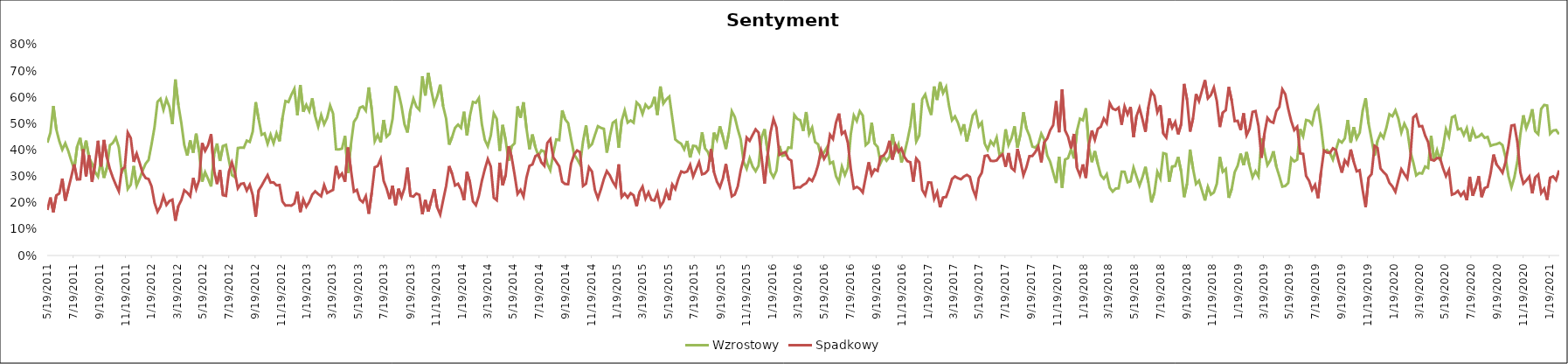
| Category | Wzrostowy | Spadkowy |
|---|---|---|
| 5/19/11 | 0.428 | 0.173 |
| 5/26/11 | 0.465 | 0.22 |
| 6/2/11 | 0.567 | 0.164 |
| 6/9/11 | 0.478 | 0.228 |
| 6/16/11 | 0.434 | 0.235 |
| 6/23/11 | 0.402 | 0.291 |
| 6/30/11 | 0.426 | 0.208 |
| 7/7/11 | 0.397 | 0.252 |
| 7/14/11 | 0.36 | 0.297 |
| 7/21/11 | 0.327 | 0.346 |
| 7/28/11 | 0.413 | 0.288 |
| 8/4/11 | 0.446 | 0.289 |
| 8/11/11 | 0.382 | 0.403 |
| 8/18/11 | 0.436 | 0.3 |
| 8/25/11 | 0.372 | 0.38 |
| 9/1/11 | 0.349 | 0.279 |
| 9/8/11 | 0.317 | 0.345 |
| 9/15/11 | 0.299 | 0.435 |
| 9/22/11 | 0.358 | 0.338 |
| 9/29/11 | 0.295 | 0.438 |
| 10/6/11 | 0.333 | 0.372 |
| 10/13/11 | 0.418 | 0.328 |
| 10/20/11 | 0.427 | 0.295 |
| 10/27/11 | 0.447 | 0.268 |
| 11/3/11 | 0.41 | 0.244 |
| 11/10/11 | 0.315 | 0.327 |
| 11/17/11 | 0.34 | 0.334 |
| 11/24/11 | 0.252 | 0.466 |
| 12/1/11 | 0.269 | 0.446 |
| 12/8/11 | 0.34 | 0.355 |
| 12/15/11 | 0.265 | 0.387 |
| 12/22/11 | 0.292 | 0.351 |
| 12/29/11 | 0.322 | 0.312 |
| 1/5/12 | 0.348 | 0.294 |
| 1/12/12 | 0.363 | 0.29 |
| 1/19/12 | 0.422 | 0.263 |
| 1/26/12 | 0.487 | 0.2 |
| 2/2/12 | 0.583 | 0.166 |
| 2/9/12 | 0.595 | 0.186 |
| 2/16/12 | 0.553 | 0.225 |
| 2/23/12 | 0.593 | 0.192 |
| 3/1/12 | 0.564 | 0.207 |
| 3/8/12 | 0.498 | 0.212 |
| 3/15/12 | 0.668 | 0.132 |
| 3/22/12 | 0.571 | 0.187 |
| 3/29/12 | 0.503 | 0.21 |
| 4/5/12 | 0.419 | 0.248 |
| 4/12/12 | 0.379 | 0.238 |
| 4/19/12 | 0.436 | 0.225 |
| 4/26/12 | 0.39 | 0.294 |
| 5/3/12 | 0.462 | 0.252 |
| 5/10/12 | 0.393 | 0.286 |
| 5/17/12 | 0.28 | 0.427 |
| 5/24/12 | 0.316 | 0.397 |
| 5/31/12 | 0.291 | 0.419 |
| 6/7/12 | 0.262 | 0.46 |
| 6/14/12 | 0.382 | 0.324 |
| 6/21/12 | 0.425 | 0.271 |
| 6/28/12 | 0.359 | 0.324 |
| 7/5/12 | 0.415 | 0.229 |
| 7/12/12 | 0.42 | 0.226 |
| 7/19/12 | 0.36 | 0.318 |
| 7/26/12 | 0.305 | 0.353 |
| 8/2/12 | 0.297 | 0.314 |
| 8/9/12 | 0.408 | 0.255 |
| 8/16/12 | 0.409 | 0.272 |
| 8/23/12 | 0.409 | 0.274 |
| 8/30/12 | 0.436 | 0.246 |
| 9/6/12 | 0.431 | 0.268 |
| 9/13/12 | 0.47 | 0.229 |
| 9/20/12 | 0.582 | 0.147 |
| 9/27/12 | 0.517 | 0.247 |
| 10/4/12 | 0.458 | 0.265 |
| 10/11/12 | 0.463 | 0.286 |
| 10/18/12 | 0.424 | 0.305 |
| 10/25/12 | 0.458 | 0.277 |
| 11/1/12 | 0.426 | 0.278 |
| 11/8/12 | 0.464 | 0.266 |
| 11/15/12 | 0.433 | 0.267 |
| 11/22/12 | 0.522 | 0.205 |
| 11/29/12 | 0.586 | 0.189 |
| 12/6/12 | 0.582 | 0.19 |
| 12/13/12 | 0.61 | 0.189 |
| 12/20/12 | 0.632 | 0.198 |
| 12/27/12 | 0.533 | 0.243 |
| 1/3/13 | 0.647 | 0.165 |
| 1/10/13 | 0.545 | 0.212 |
| 1/17/13 | 0.571 | 0.185 |
| 1/24/13 | 0.548 | 0.203 |
| 1/31/13 | 0.596 | 0.231 |
| 2/7/13 | 0.528 | 0.243 |
| 2/14/13 | 0.489 | 0.233 |
| 2/21/13 | 0.533 | 0.225 |
| 2/28/13 | 0.498 | 0.267 |
| 3/7/13 | 0.522 | 0.237 |
| 3/14/13 | 0.569 | 0.243 |
| 3/21/13 | 0.539 | 0.249 |
| 3/28/13 | 0.403 | 0.34 |
| 4/4/13 | 0.402 | 0.297 |
| 4/11/13 | 0.406 | 0.311 |
| 4/18/13 | 0.453 | 0.28 |
| 4/25/13 | 0.313 | 0.41 |
| 5/2/13 | 0.422 | 0.325 |
| 5/9/13 | 0.507 | 0.242 |
| 5/16/13 | 0.524 | 0.249 |
| 5/23/13 | 0.561 | 0.212 |
| 5/30/13 | 0.566 | 0.202 |
| 6/6/13 | 0.549 | 0.225 |
| 6/13/13 | 0.638 | 0.158 |
| 6/20/13 | 0.553 | 0.24 |
| 6/27/13 | 0.433 | 0.335 |
| 7/4/13 | 0.458 | 0.34 |
| 7/11/13 | 0.429 | 0.366 |
| 7/18/13 | 0.514 | 0.283 |
| 7/25/13 | 0.451 | 0.254 |
| 8/1/13 | 0.462 | 0.214 |
| 8/8/13 | 0.519 | 0.265 |
| 8/15/13 | 0.642 | 0.19 |
| 8/22/13 | 0.618 | 0.253 |
| 8/29/13 | 0.567 | 0.221 |
| 9/5/13 | 0.498 | 0.255 |
| 9/12/13 | 0.467 | 0.333 |
| 9/19/13 | 0.552 | 0.226 |
| 9/26/13 | 0.595 | 0.224 |
| 10/3/13 | 0.564 | 0.235 |
| 10/10/13 | 0.552 | 0.23 |
| 10/17/13 | 0.68 | 0.156 |
| 10/24/13 | 0.607 | 0.211 |
| 10/31/13 | 0.693 | 0.167 |
| 11/7/13 | 0.627 | 0.209 |
| 11/14/13 | 0.573 | 0.252 |
| 11/21/13 | 0.604 | 0.182 |
| 11/28/13 | 0.648 | 0.155 |
| 12/5/13 | 0.566 | 0.211 |
| 12/12/13 | 0.519 | 0.264 |
| 12/19/13 | 0.42 | 0.339 |
| 12/26/13 | 0.45 | 0.31 |
| 1/2/14 | 0.484 | 0.266 |
| 1/9/14 | 0.497 | 0.272 |
| 1/16/14 | 0.484 | 0.25 |
| 1/23/14 | 0.545 | 0.21 |
| 1/30/14 | 0.455 | 0.317 |
| 2/6/14 | 0.531 | 0.278 |
| 2/13/14 | 0.582 | 0.205 |
| 2/20/14 | 0.579 | 0.191 |
| 2/27/14 | 0.597 | 0.227 |
| 3/6/14 | 0.498 | 0.283 |
| 3/13/14 | 0.439 | 0.327 |
| 3/20/14 | 0.415 | 0.366 |
| 3/27/14 | 0.455 | 0.337 |
| 4/3/14 | 0.539 | 0.219 |
| 4/10/14 | 0.519 | 0.21 |
| 4/17/14 | 0.397 | 0.352 |
| 4/24/14 | 0.495 | 0.266 |
| 5/1/14 | 0.437 | 0.306 |
| 5/8/14 | 0.359 | 0.415 |
| 5/15/14 | 0.414 | 0.374 |
| 5/22/14 | 0.425 | 0.307 |
| 5/29/14 | 0.566 | 0.234 |
| 6/5/14 | 0.522 | 0.249 |
| 6/12/14 | 0.581 | 0.224 |
| 6/19/14 | 0.482 | 0.295 |
| 6/26/14 | 0.403 | 0.34 |
| 7/3/14 | 0.459 | 0.345 |
| 7/10/14 | 0.41 | 0.377 |
| 7/17/14 | 0.379 | 0.383 |
| 7/24/14 | 0.399 | 0.353 |
| 7/31/14 | 0.394 | 0.34 |
| 8/7/14 | 0.348 | 0.427 |
| 8/14/14 | 0.324 | 0.441 |
| 8/21/14 | 0.386 | 0.373 |
| 8/28/14 | 0.44 | 0.356 |
| 9/4/14 | 0.438 | 0.338 |
| 9/11/14 | 0.551 | 0.28 |
| 9/18/14 | 0.516 | 0.271 |
| 9/25/14 | 0.502 | 0.271 |
| 10/2/14 | 0.441 | 0.349 |
| 10/9/14 | 0.383 | 0.383 |
| 10/16/14 | 0.366 | 0.398 |
| 10/23/14 | 0.345 | 0.392 |
| 10/30/14 | 0.433 | 0.264 |
| 11/6/14 | 0.494 | 0.272 |
| 11/13/14 | 0.411 | 0.335 |
| 11/20/14 | 0.422 | 0.319 |
| 11/27/14 | 0.457 | 0.248 |
| 12/4/14 | 0.49 | 0.217 |
| 12/11/14 | 0.484 | 0.251 |
| 12/18/14 | 0.481 | 0.29 |
| 12/25/14 | 0.39 | 0.32 |
| 1/1/15 | 0.451 | 0.304 |
| 1/8/15 | 0.503 | 0.28 |
| 1/15/15 | 0.512 | 0.262 |
| 1/22/15 | 0.409 | 0.346 |
| 1/29/15 | 0.511 | 0.222 |
| 2/5/15 | 0.55 | 0.235 |
| 2/12/15 | 0.504 | 0.22 |
| 2/19/15 | 0.512 | 0.236 |
| 2/26/15 | 0.504 | 0.228 |
| 3/5/15 | 0.581 | 0.186 |
| 3/12/15 | 0.57 | 0.241 |
| 3/19/15 | 0.537 | 0.261 |
| 3/26/15 | 0.573 | 0.216 |
| 4/2/15 | 0.559 | 0.239 |
| 4/9/15 | 0.568 | 0.211 |
| 4/16/15 | 0.602 | 0.208 |
| 4/23/15 | 0.533 | 0.238 |
| 4/30/15 | 0.641 | 0.187 |
| 5/7/15 | 0.577 | 0.204 |
| 5/14/15 | 0.593 | 0.243 |
| 5/21/15 | 0.603 | 0.21 |
| 5/28/15 | 0.521 | 0.269 |
| 6/4/15 | 0.44 | 0.252 |
| 6/11/15 | 0.431 | 0.29 |
| 6/18/15 | 0.424 | 0.319 |
| 6/25/15 | 0.403 | 0.314 |
| 7/2/15 | 0.435 | 0.319 |
| 7/9/15 | 0.372 | 0.344 |
| 7/16/15 | 0.416 | 0.3 |
| 7/23/15 | 0.415 | 0.327 |
| 7/30/15 | 0.393 | 0.354 |
| 8/6/15 | 0.467 | 0.308 |
| 8/13/15 | 0.407 | 0.311 |
| 8/20/15 | 0.392 | 0.324 |
| 8/27/15 | 0.357 | 0.403 |
| 9/3/15 | 0.466 | 0.316 |
| 9/10/15 | 0.44 | 0.28 |
| 9/17/15 | 0.49 | 0.259 |
| 9/24/15 | 0.451 | 0.292 |
| 10/1/15 | 0.404 | 0.347 |
| 10/8/15 | 0.466 | 0.283 |
| 10/15/15 | 0.547 | 0.224 |
| 10/22/15 | 0.525 | 0.231 |
| 10/29/15 | 0.479 | 0.262 |
| 11/5/15 | 0.44 | 0.324 |
| 11/12/15 | 0.354 | 0.369 |
| 11/19/15 | 0.329 | 0.447 |
| 11/26/15 | 0.369 | 0.435 |
| 12/3/15 | 0.337 | 0.457 |
| 12/10/15 | 0.32 | 0.478 |
| 12/17/15 | 0.341 | 0.466 |
| 12/24/15 | 0.449 | 0.374 |
| 12/31/15 | 0.479 | 0.273 |
| 1/7/16 | 0.398 | 0.378 |
| 1/14/16 | 0.317 | 0.466 |
| 1/21/16 | 0.297 | 0.517 |
| 1/28/16 | 0.322 | 0.485 |
| 2/4/16 | 0.415 | 0.382 |
| 2/11/16 | 0.378 | 0.388 |
| 2/18/16 | 0.381 | 0.392 |
| 2/25/16 | 0.41 | 0.367 |
| 3/3/16 | 0.408 | 0.36 |
| 3/10/16 | 0.533 | 0.256 |
| 3/17/16 | 0.518 | 0.259 |
| 3/24/16 | 0.513 | 0.258 |
| 3/31/16 | 0.472 | 0.268 |
| 4/7/16 | 0.544 | 0.274 |
| 4/14/16 | 0.461 | 0.292 |
| 4/21/16 | 0.485 | 0.283 |
| 4/28/16 | 0.43 | 0.307 |
| 5/5/16 | 0.422 | 0.343 |
| 5/12/16 | 0.375 | 0.399 |
| 5/19/16 | 0.392 | 0.367 |
| 5/26/16 | 0.411 | 0.386 |
| 6/2/16 | 0.349 | 0.458 |
| 6/9/16 | 0.355 | 0.442 |
| 6/16/16 | 0.302 | 0.504 |
| 6/23/16 | 0.278 | 0.538 |
| 6/30/16 | 0.337 | 0.461 |
| 7/7/16 | 0.305 | 0.471 |
| 7/14/16 | 0.333 | 0.428 |
| 7/21/16 | 0.462 | 0.327 |
| 7/28/16 | 0.531 | 0.254 |
| 8/4/16 | 0.51 | 0.26 |
| 8/11/16 | 0.548 | 0.253 |
| 8/18/16 | 0.531 | 0.239 |
| 8/25/16 | 0.419 | 0.297 |
| 9/1/16 | 0.429 | 0.354 |
| 9/8/16 | 0.504 | 0.306 |
| 9/15/16 | 0.424 | 0.327 |
| 9/22/16 | 0.412 | 0.321 |
| 9/29/16 | 0.351 | 0.375 |
| 10/6/16 | 0.375 | 0.379 |
| 10/13/16 | 0.36 | 0.395 |
| 10/20/16 | 0.375 | 0.435 |
| 10/27/16 | 0.461 | 0.364 |
| 11/3/16 | 0.396 | 0.419 |
| 11/10/16 | 0.421 | 0.394 |
| 11/17/16 | 0.353 | 0.406 |
| 11/24/16 | 0.387 | 0.374 |
| 12/1/16 | 0.436 | 0.358 |
| 12/8/16 | 0.491 | 0.354 |
| 12/15/16 | 0.578 | 0.28 |
| 12/22/16 | 0.433 | 0.368 |
| 12/29/16 | 0.455 | 0.354 |
| 1/5/17 | 0.593 | 0.249 |
| 1/12/17 | 0.611 | 0.229 |
| 1/19/17 | 0.566 | 0.277 |
| 1/26/17 | 0.533 | 0.277 |
| 2/2/17 | 0.641 | 0.215 |
| 2/9/17 | 0.59 | 0.24 |
| 2/16/17 | 0.658 | 0.183 |
| 2/23/17 | 0.616 | 0.22 |
| 3/2/17 | 0.639 | 0.222 |
| 3/9/17 | 0.568 | 0.253 |
| 3/16/17 | 0.513 | 0.29 |
| 3/23/17 | 0.528 | 0.3 |
| 3/30/17 | 0.503 | 0.293 |
| 4/6/17 | 0.467 | 0.289 |
| 4/13/17 | 0.498 | 0.3 |
| 4/20/17 | 0.432 | 0.306 |
| 4/27/17 | 0.481 | 0.298 |
| 5/4/17 | 0.532 | 0.252 |
| 5/11/17 | 0.546 | 0.223 |
| 5/18/17 | 0.49 | 0.294 |
| 5/25/17 | 0.505 | 0.314 |
| 6/1/17 | 0.425 | 0.377 |
| 6/8/17 | 0.402 | 0.38 |
| 6/15/17 | 0.434 | 0.359 |
| 6/22/17 | 0.419 | 0.358 |
| 6/29/17 | 0.447 | 0.361 |
| 7/6/17 | 0.379 | 0.375 |
| 7/13/17 | 0.391 | 0.384 |
| 7/20/17 | 0.479 | 0.336 |
| 7/27/17 | 0.42 | 0.389 |
| 8/3/17 | 0.445 | 0.332 |
| 8/10/17 | 0.49 | 0.322 |
| 8/17/17 | 0.409 | 0.405 |
| 8/24/17 | 0.46 | 0.358 |
| 8/31/17 | 0.544 | 0.304 |
| 9/7/17 | 0.482 | 0.335 |
| 9/14/17 | 0.455 | 0.377 |
| 9/21/17 | 0.413 | 0.378 |
| 9/28/17 | 0.409 | 0.392 |
| 10/5/17 | 0.422 | 0.414 |
| 10/12/17 | 0.462 | 0.353 |
| 10/19/17 | 0.439 | 0.43 |
| 10/26/17 | 0.379 | 0.444 |
| 11/2/17 | 0.355 | 0.475 |
| 11/9/17 | 0.315 | 0.494 |
| 11/16/17 | 0.275 | 0.586 |
| 11/23/17 | 0.375 | 0.467 |
| 11/30/17 | 0.257 | 0.63 |
| 12/7/17 | 0.364 | 0.475 |
| 12/14/17 | 0.369 | 0.451 |
| 12/21/17 | 0.403 | 0.407 |
| 12/28/17 | 0.368 | 0.461 |
| 1/4/18 | 0.473 | 0.332 |
| 1/11/18 | 0.519 | 0.304 |
| 1/18/18 | 0.513 | 0.346 |
| 1/25/18 | 0.559 | 0.294 |
| 2/1/18 | 0.412 | 0.421 |
| 2/8/18 | 0.354 | 0.474 |
| 2/15/18 | 0.396 | 0.439 |
| 2/22/18 | 0.347 | 0.481 |
| 3/1/18 | 0.305 | 0.488 |
| 3/8/18 | 0.291 | 0.52 |
| 3/15/18 | 0.308 | 0.502 |
| 3/22/18 | 0.257 | 0.578 |
| 3/29/18 | 0.242 | 0.557 |
| 4/5/18 | 0.254 | 0.552 |
| 4/12/18 | 0.255 | 0.561 |
| 4/19/18 | 0.318 | 0.496 |
| 4/26/18 | 0.317 | 0.565 |
| 5/3/18 | 0.278 | 0.535 |
| 5/10/18 | 0.282 | 0.564 |
| 5/17/18 | 0.333 | 0.449 |
| 5/24/18 | 0.299 | 0.529 |
| 5/31/18 | 0.266 | 0.56 |
| 6/7/18 | 0.297 | 0.517 |
| 6/14/18 | 0.336 | 0.469 |
| 6/21/18 | 0.277 | 0.562 |
| 6/28/18 | 0.202 | 0.622 |
| 7/5/18 | 0.238 | 0.606 |
| 7/12/18 | 0.317 | 0.543 |
| 7/19/18 | 0.293 | 0.57 |
| 7/26/18 | 0.388 | 0.463 |
| 8/2/18 | 0.385 | 0.448 |
| 8/9/18 | 0.279 | 0.52 |
| 8/16/18 | 0.338 | 0.484 |
| 8/23/18 | 0.339 | 0.507 |
| 8/30/18 | 0.374 | 0.46 |
| 9/6/18 | 0.32 | 0.498 |
| 9/13/18 | 0.221 | 0.651 |
| 9/20/18 | 0.273 | 0.59 |
| 9/27/18 | 0.402 | 0.47 |
| 10/4/18 | 0.329 | 0.521 |
| 10/11/18 | 0.271 | 0.612 |
| 10/18/18 | 0.284 | 0.585 |
| 10/25/18 | 0.247 | 0.626 |
| 11/1/18 | 0.209 | 0.665 |
| 11/8/18 | 0.26 | 0.596 |
| 11/15/18 | 0.231 | 0.609 |
| 11/22/18 | 0.239 | 0.637 |
| 11/29/18 | 0.272 | 0.585 |
| 12/6/18 | 0.374 | 0.487 |
| 12/13/18 | 0.317 | 0.543 |
| 12/20/18 | 0.328 | 0.551 |
| 12/27/18 | 0.219 | 0.639 |
| 1/3/19 | 0.253 | 0.588 |
| 1/10/19 | 0.316 | 0.51 |
| 1/17/19 | 0.341 | 0.511 |
| 1/24/19 | 0.387 | 0.476 |
| 1/31/19 | 0.343 | 0.539 |
| 2/7/19 | 0.392 | 0.457 |
| 2/14/19 | 0.339 | 0.481 |
| 2/21/19 | 0.297 | 0.545 |
| 2/28/19 | 0.32 | 0.548 |
| 3/7/19 | 0.3 | 0.491 |
| 3/14/19 | 0.444 | 0.371 |
| 3/21/19 | 0.394 | 0.463 |
| 3/28/19 | 0.343 | 0.522 |
| 4/4/19 | 0.361 | 0.508 |
| 4/11/19 | 0.396 | 0.504 |
| 4/18/19 | 0.337 | 0.548 |
| 4/25/19 | 0.301 | 0.564 |
| 5/2/19 | 0.261 | 0.631 |
| 5/9/19 | 0.264 | 0.612 |
| 5/16/19 | 0.276 | 0.556 |
| 5/23/19 | 0.369 | 0.51 |
| 5/30/19 | 0.357 | 0.476 |
| 6/6/19 | 0.364 | 0.489 |
| 6/13/19 | 0.48 | 0.387 |
| 6/20/19 | 0.453 | 0.385 |
| 6/27/19 | 0.514 | 0.302 |
| 7/4/19 | 0.511 | 0.283 |
| 7/11/19 | 0.497 | 0.249 |
| 7/18/19 | 0.547 | 0.268 |
| 7/25/19 | 0.565 | 0.217 |
| 8/1/19 | 0.49 | 0.315 |
| 8/8/19 | 0.393 | 0.398 |
| 8/15/19 | 0.4 | 0.391 |
| 8/22/19 | 0.389 | 0.389 |
| 8/29/19 | 0.364 | 0.407 |
| 9/5/19 | 0.4 | 0.4 |
| 9/12/19 | 0.438 | 0.354 |
| 9/19/19 | 0.429 | 0.314 |
| 9/26/19 | 0.444 | 0.361 |
| 10/3/19 | 0.514 | 0.345 |
| 10/10/19 | 0.428 | 0.402 |
| 10/17/19 | 0.487 | 0.356 |
| 10/24/19 | 0.443 | 0.32 |
| 10/31/19 | 0.466 | 0.324 |
| 11/7/19 | 0.549 | 0.249 |
| 11/14/19 | 0.597 | 0.183 |
| 11/21/19 | 0.5 | 0.295 |
| 11/28/19 | 0.441 | 0.309 |
| 12/5/19 | 0.379 | 0.416 |
| 12/12/19 | 0.435 | 0.408 |
| 12/19/19 | 0.462 | 0.33 |
| 12/26/19 | 0.446 | 0.317 |
| 1/2/20 | 0.486 | 0.305 |
| 1/9/20 | 0.536 | 0.276 |
| 1/16/20 | 0.528 | 0.262 |
| 1/23/20 | 0.551 | 0.242 |
| 1/30/20 | 0.519 | 0.286 |
| 2/6/20 | 0.466 | 0.327 |
| 2/13/20 | 0.5 | 0.309 |
| 2/20/20 | 0.477 | 0.292 |
| 2/27/20 | 0.396 | 0.37 |
| 3/5/20 | 0.354 | 0.524 |
| 3/12/20 | 0.304 | 0.534 |
| 3/19/20 | 0.313 | 0.49 |
| 3/26/20 | 0.311 | 0.491 |
| 4/2/20 | 0.337 | 0.455 |
| 4/9/20 | 0.332 | 0.43 |
| 4/16/20 | 0.455 | 0.364 |
| 4/23/20 | 0.36 | 0.36 |
| 4/30/20 | 0.399 | 0.37 |
| 5/7/20 | 0.36 | 0.369 |
| 5/14/20 | 0.41 | 0.332 |
| 5/21/20 | 0.48 | 0.301 |
| 5/28/20 | 0.451 | 0.324 |
| 6/4/20 | 0.524 | 0.231 |
| 6/11/20 | 0.53 | 0.235 |
| 6/18/20 | 0.479 | 0.245 |
| 6/25/20 | 0.482 | 0.227 |
| 7/2/20 | 0.457 | 0.241 |
| 7/9/20 | 0.483 | 0.21 |
| 7/16/20 | 0.433 | 0.299 |
| 7/23/20 | 0.477 | 0.227 |
| 7/30/20 | 0.448 | 0.259 |
| 8/6/20 | 0.451 | 0.301 |
| 8/13/20 | 0.461 | 0.222 |
| 8/20/20 | 0.446 | 0.256 |
| 8/27/20 | 0.45 | 0.26 |
| 9/3/20 | 0.416 | 0.312 |
| 9/10/20 | 0.42 | 0.383 |
| 9/17/20 | 0.423 | 0.345 |
| 9/24/20 | 0.428 | 0.331 |
| 10/1/20 | 0.419 | 0.314 |
| 10/8/20 | 0.373 | 0.353 |
| 10/15/20 | 0.301 | 0.416 |
| 10/22/20 | 0.259 | 0.493 |
| 10/29/20 | 0.297 | 0.495 |
| 11/5/20 | 0.357 | 0.43 |
| 11/12/20 | 0.46 | 0.316 |
| 11/19/20 | 0.532 | 0.273 |
| 11/26/20 | 0.483 | 0.285 |
| 12/3/20 | 0.513 | 0.299 |
| 12/10/20 | 0.555 | 0.236 |
| 12/17/20 | 0.471 | 0.296 |
| 12/24/20 | 0.46 | 0.307 |
| 12/31/20 | 0.556 | 0.237 |
| 1/7/21 | 0.571 | 0.253 |
| 1/14/21 | 0.569 | 0.211 |
| 1/21/21 | 0.462 | 0.295 |
| 1/28/21 | 0.474 | 0.3 |
| 2/4/21 | 0.476 | 0.286 |
| 2/11/21 | 0.46 | 0.323 |